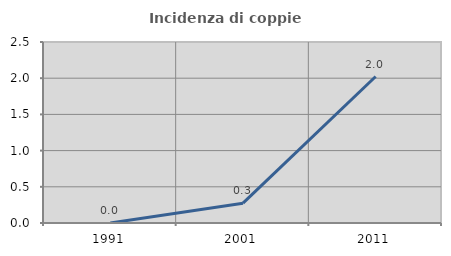
| Category | Incidenza di coppie miste |
|---|---|
| 1991.0 | 0 |
| 2001.0 | 0.274 |
| 2011.0 | 2.023 |